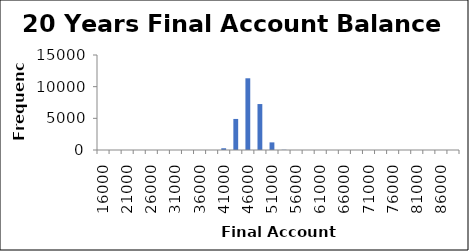
| Category | Frequency |
|---|---|
| 16000.0 | 0 |
| 18500.0 | 0 |
| 21000.0 | 0 |
| 23500.0 | 0 |
| 26000.0 | 0 |
| 28500.0 | 0 |
| 31000.0 | 0 |
| 33500.0 | 0 |
| 36000.0 | 0 |
| 38500.0 | 0 |
| 41000.0 | 275 |
| 43500.0 | 4903 |
| 46000.0 | 11324 |
| 48500.0 | 7256 |
| 51000.0 | 1204 |
| 53500.0 | 38 |
| 56000.0 | 0 |
| 58500.0 | 0 |
| 61000.0 | 0 |
| 63500.0 | 0 |
| 66000.0 | 0 |
| 68500.0 | 0 |
| 71000.0 | 0 |
| 73500.0 | 0 |
| 76000.0 | 0 |
| 78500.0 | 0 |
| 81000.0 | 0 |
| 83500.0 | 0 |
| 86000.0 | 0 |
| More | 0 |